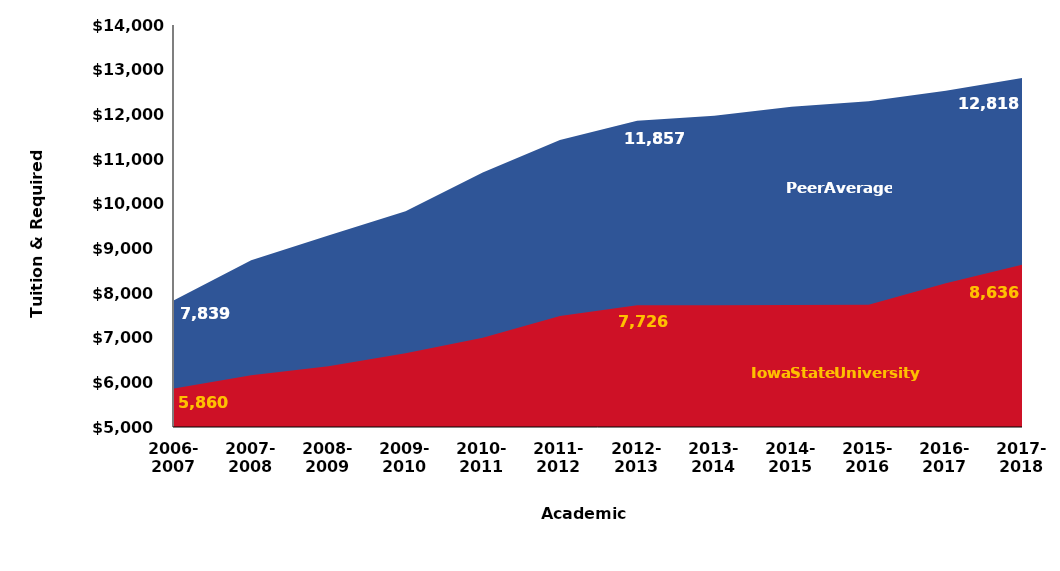
| Category | Peer Average | Iowa State University |
|---|---|---|
| 2006-
2007 | 7839.415 | 5860 |
| 2007-
2008 | 8734.088 | 6161.32 |
| 2008-
2009 | 9289.001 | 6360 |
| 2009-
2010 | 9830.583 | 6651 |
| 2010-
2011 | 10698.1 | 6997 |
| 2011-
2012 | 11423.4 | 7486 |
| 2012-
2013 | 11856.7 | 7726 |
| 2013-
2014 | 11970.78 | 7726 |
| 2014-
2015 | 12168.48 | 7731.4 |
| 2015-
2016 | 12290.456 | 7735.9 |
| 2016-
2017 | 12528.628 | 8219.4 |
| 2017-
2018 | 12817.8 | 8635.9 |